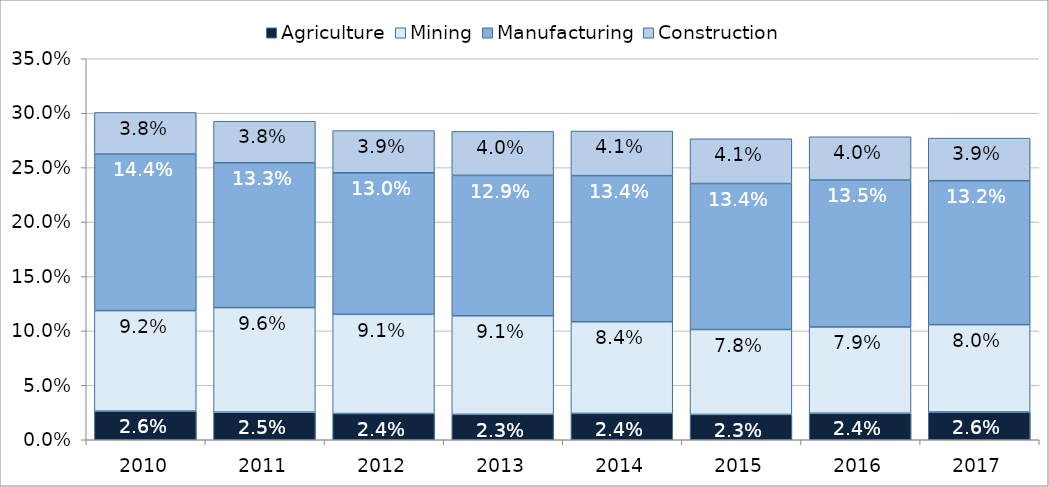
| Category |  Agriculture  |  Mining  |  Manufacturing  |  Construction  |
|---|---|---|---|---|
| 2010.0 | 0.026 | 0.092 | 0.144 | 0.038 |
| 2011.0 | 0.025 | 0.096 | 0.133 | 0.038 |
| 2012.0 | 0.024 | 0.091 | 0.13 | 0.039 |
| 2013.0 | 0.023 | 0.091 | 0.129 | 0.04 |
| 2014.0 | 0.024 | 0.084 | 0.134 | 0.041 |
| 2015.0 | 0.023 | 0.078 | 0.134 | 0.041 |
| 2016.0 | 0.024 | 0.079 | 0.135 | 0.04 |
| 2017.0 | 0.026 | 0.08 | 0.132 | 0.039 |